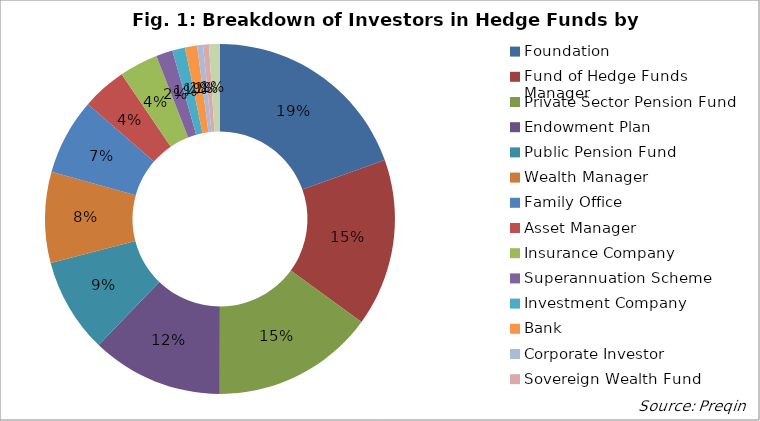
| Category | Proportion |
|---|---|
| Foundation | 0.194 |
| Fund of Hedge Funds Manager | 0.154 |
| Private Sector Pension Fund | 0.149 |
| Endowment Plan | 0.121 |
| Public Pension Fund | 0.087 |
| Wealth Manager | 0.084 |
| Family Office | 0.07 |
| Asset Manager | 0.041 |
| Insurance Company | 0.036 |
| Superannuation Scheme | 0.015 |
| Investment Company | 0.012 |
| Bank | 0.011 |
| Corporate Investor | 0.005 |
| Sovereign Wealth Fund | 0.005 |
| Other | 0.01 |